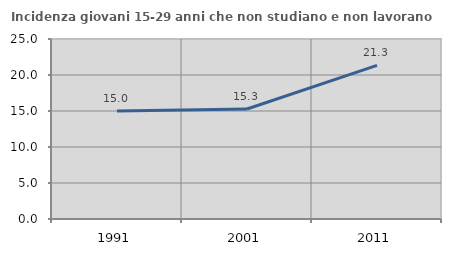
| Category | Incidenza giovani 15-29 anni che non studiano e non lavorano  |
|---|---|
| 1991.0 | 15.004 |
| 2001.0 | 15.278 |
| 2011.0 | 21.333 |